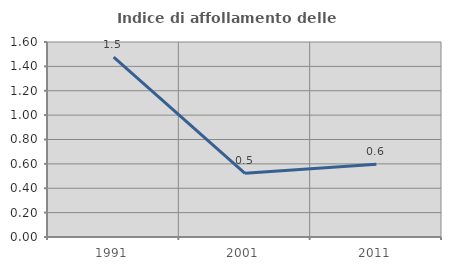
| Category | Indice di affollamento delle abitazioni  |
|---|---|
| 1991.0 | 1.476 |
| 2001.0 | 0.523 |
| 2011.0 | 0.597 |